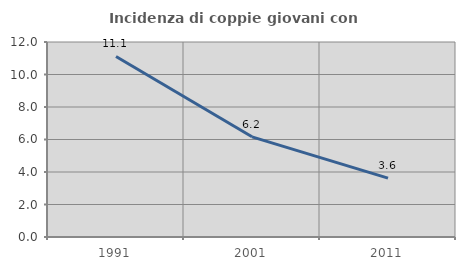
| Category | Incidenza di coppie giovani con figli |
|---|---|
| 1991.0 | 11.111 |
| 2001.0 | 6.164 |
| 2011.0 | 3.623 |